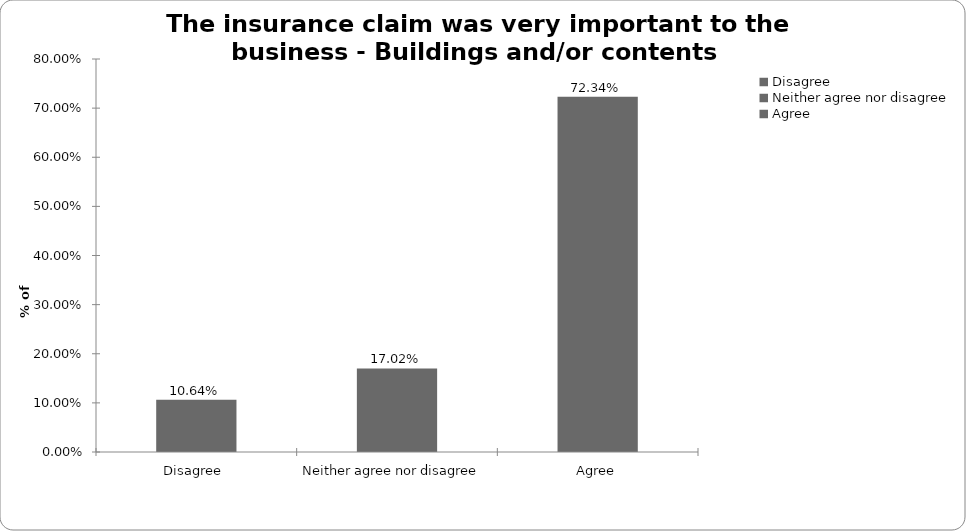
| Category | Buildings and/or conents |
|---|---|
| Disagree  | 0.106 |
| Neither agree nor disagree  | 0.17 |
| Agree | 0.723 |